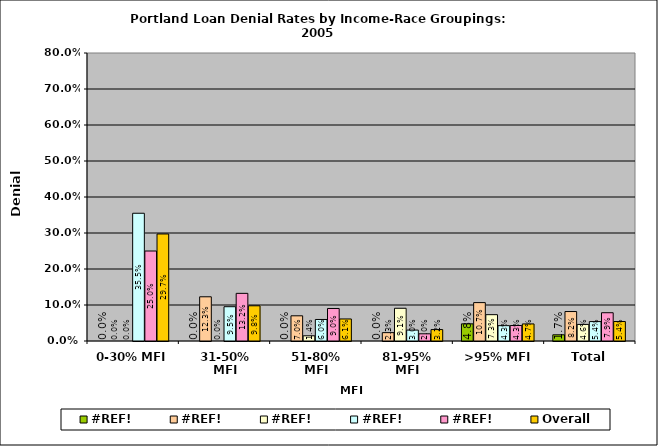
| Category | #REF! | Overall |
|---|---|---|
| 0-30% MFI | 0.25 | 0.297 |
| 31-50% MFI | 0.132 | 0.098 |
| 51-80% MFI | 0.09 | 0.061 |
| 81-95% MFI | 0.02 | 0.032 |
| >95% MFI | 0.043 | 0.047 |
| Total | 0.079 | 0.054 |